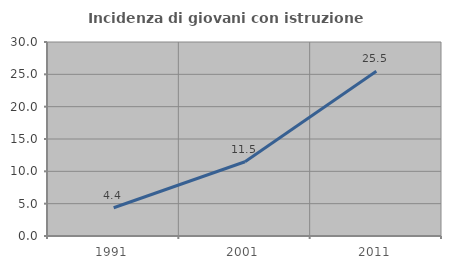
| Category | Incidenza di giovani con istruzione universitaria |
|---|---|
| 1991.0 | 4.369 |
| 2001.0 | 11.483 |
| 2011.0 | 25.49 |